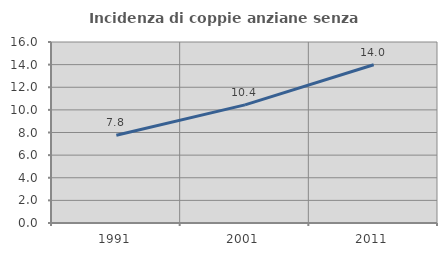
| Category | Incidenza di coppie anziane senza figli  |
|---|---|
| 1991.0 | 7.762 |
| 2001.0 | 10.442 |
| 2011.0 | 13.99 |